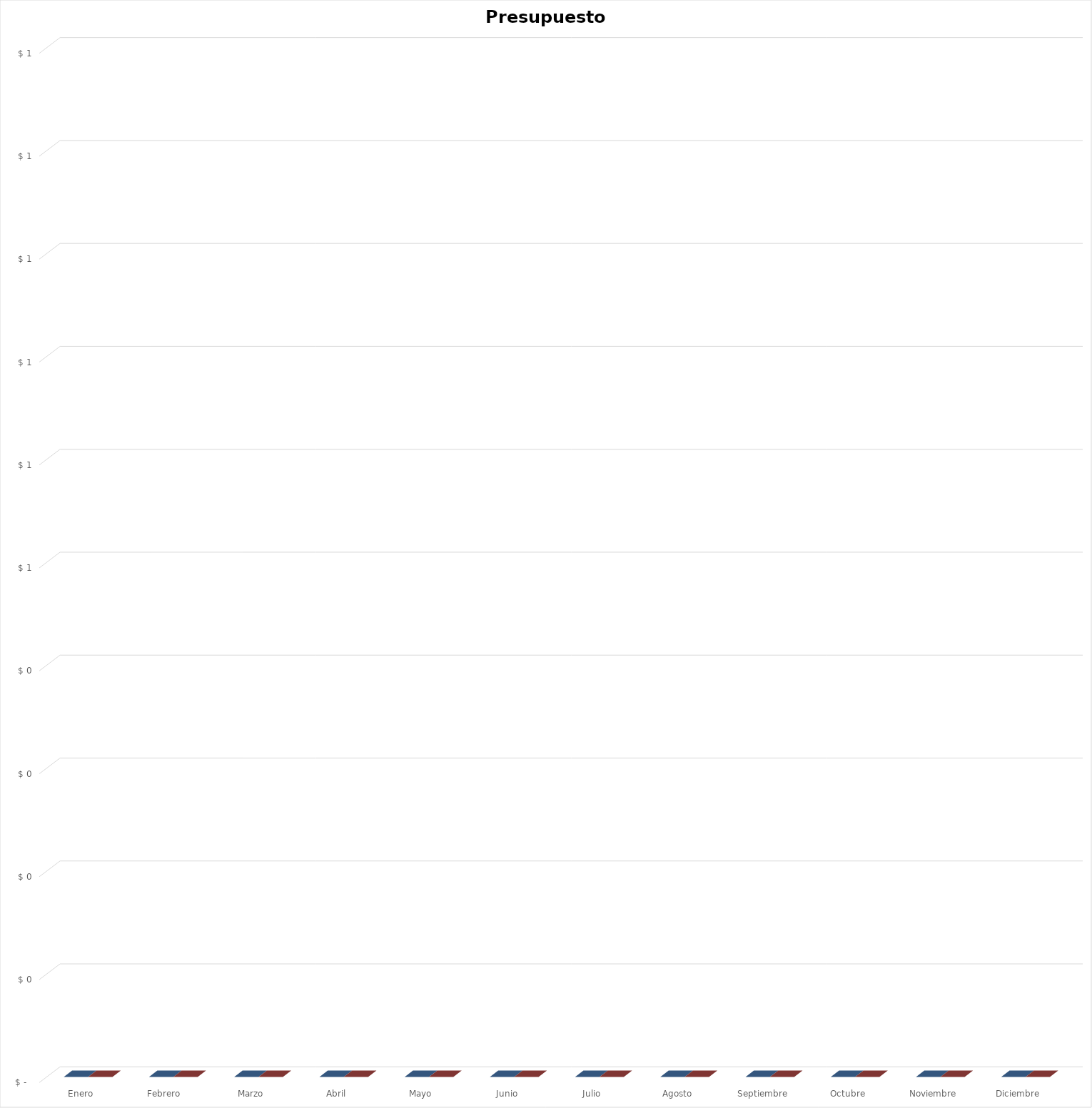
| Category | PRESUPUESTO PROGRAMADO | PRESUPUESTO EJECUTADO |
|---|---|---|
| Enero | 0 | 0 |
| Febrero  | 0 | 0 |
| Marzo | 0 | 0 |
| Abril | 0 | 0 |
| Mayo  | 0 | 0 |
| Junio | 0 | 0 |
| Julio | 0 | 0 |
| Agosto | 0 | 0 |
| Septiembre | 0 | 0 |
| Octubre | 0 | 0 |
| Noviembre | 0 | 0 |
| Diciembre | 0 | 0 |